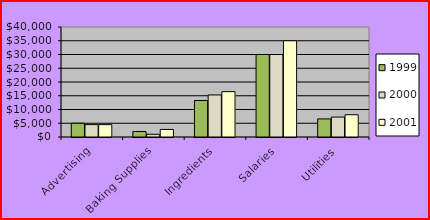
| Category | 1999 | 2000 | 2001 |
|---|---|---|---|
| Advertising | 5000 | 4500 | 4500 |
| Baking Supplies | 2000 | 1000 | 2750 |
| Ingredients | 13275 | 15298 | 16490 |
| Salaries | 30000 | 30000 | 35000 |
| Utilities | 6570 | 7250 | 8090 |